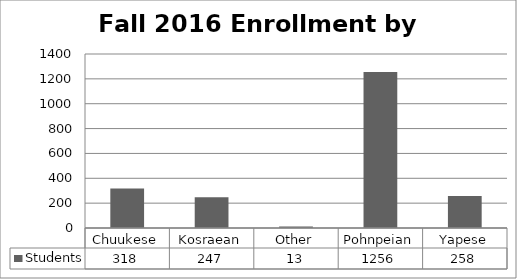
| Category | Students |
|---|---|
| Chuukese | 318 |
| Kosraean | 247 |
| Other | 13 |
| Pohnpeian | 1256 |
| Yapese | 258 |